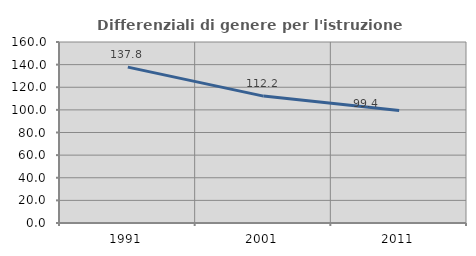
| Category | Differenziali di genere per l'istruzione superiore |
|---|---|
| 1991.0 | 137.817 |
| 2001.0 | 112.173 |
| 2011.0 | 99.369 |